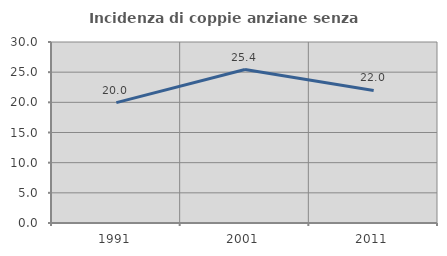
| Category | Incidenza di coppie anziane senza figli  |
|---|---|
| 1991.0 | 19.956 |
| 2001.0 | 25.441 |
| 2011.0 | 21.965 |